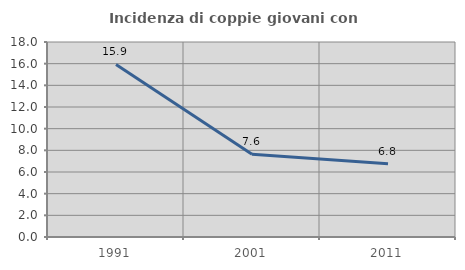
| Category | Incidenza di coppie giovani con figli |
|---|---|
| 1991.0 | 15.929 |
| 2001.0 | 7.636 |
| 2011.0 | 6.765 |